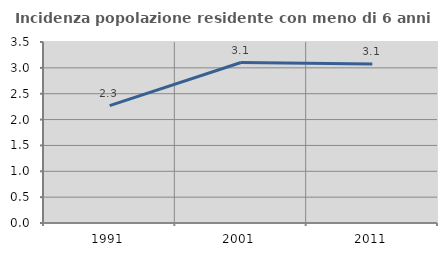
| Category | Incidenza popolazione residente con meno di 6 anni |
|---|---|
| 1991.0 | 2.268 |
| 2001.0 | 3.103 |
| 2011.0 | 3.077 |